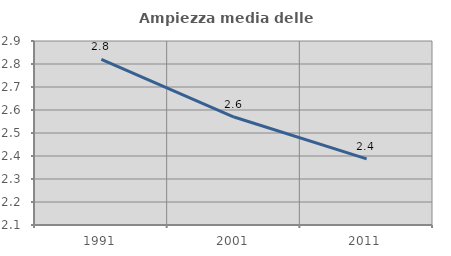
| Category | Ampiezza media delle famiglie |
|---|---|
| 1991.0 | 2.82 |
| 2001.0 | 2.569 |
| 2011.0 | 2.387 |